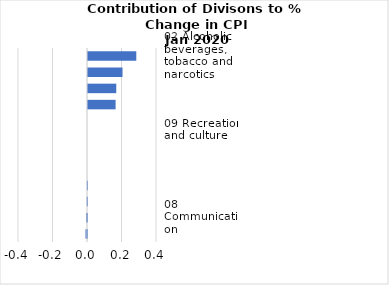
| Category |     Contributions |
|---|---|
| 02 Alcoholic beverages, tobacco and narcotics | 0.28 |
| 07 Transport | 0.2 |
| 01 Food and non-alcoholic beverages | 0.164 |
| 04 Housing, water, electricity, gas and other fuels | 0.16 |
| 11 Restaurants and hotels | 0 |
| 09 Recreation and culture | 0 |
| 10 Education | 0 |
| 06 Health | 0 |
| 05 Furnishings, household equipment and routine household maintenance | -0.001 |
| 03 Clothing and footwear | -0.002 |
| 08 Communication | -0.006 |
| 12 Miscellaneous goods and services | -0.009 |